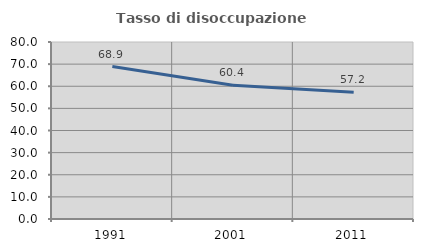
| Category | Tasso di disoccupazione giovanile  |
|---|---|
| 1991.0 | 68.899 |
| 2001.0 | 60.421 |
| 2011.0 | 57.237 |